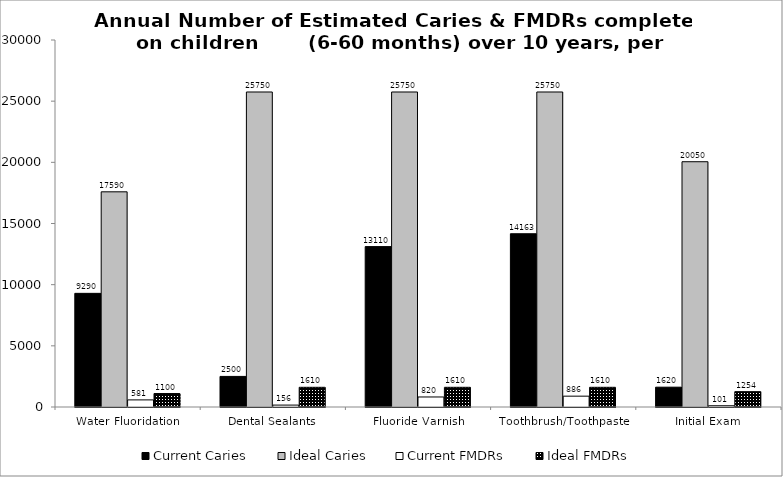
| Category | Current Caries | Ideal Caries | Current FMDRs | Ideal FMDRs |
|---|---|---|---|---|
| Water Fluoridation | 9290 | 17590 | 580.85 | 1099.802 |
| Dental Sealants | 2500 | 25750 | 156.311 | 1610 |
| Fluoride Varnish | 13110 | 25750 | 819.693 | 1610 |
| Toothbrush/Toothpaste | 14162.5 | 25750 | 885.5 | 1610 |
| Initial Exam | 1620 | 20050 | 101.289 | 1253.612 |